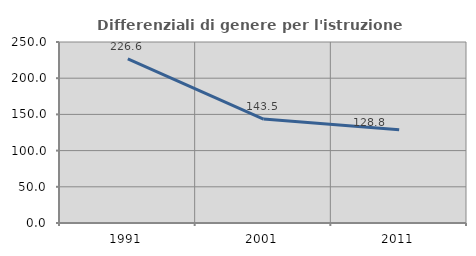
| Category | Differenziali di genere per l'istruzione superiore |
|---|---|
| 1991.0 | 226.562 |
| 2001.0 | 143.526 |
| 2011.0 | 128.761 |